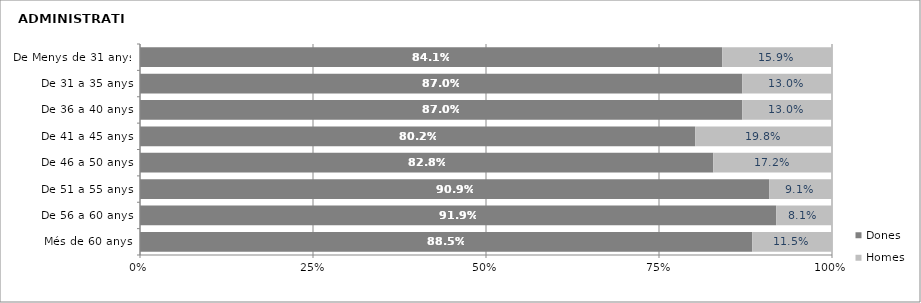
| Category | Dones | Homes |
|---|---|---|
| Més de 60 anys | 0.885 | 0.115 |
| De 56 a 60 anys | 0.919 | 0.081 |
| De 51 a 55 anys | 0.909 | 0.091 |
| De 46 a 50 anys | 0.828 | 0.172 |
| De 41 a 45 anys | 0.802 | 0.198 |
| De 36 a 40 anys | 0.87 | 0.13 |
| De 31 a 35 anys | 0.87 | 0.13 |
| De Menys de 31 anys | 0.841 | 0.159 |